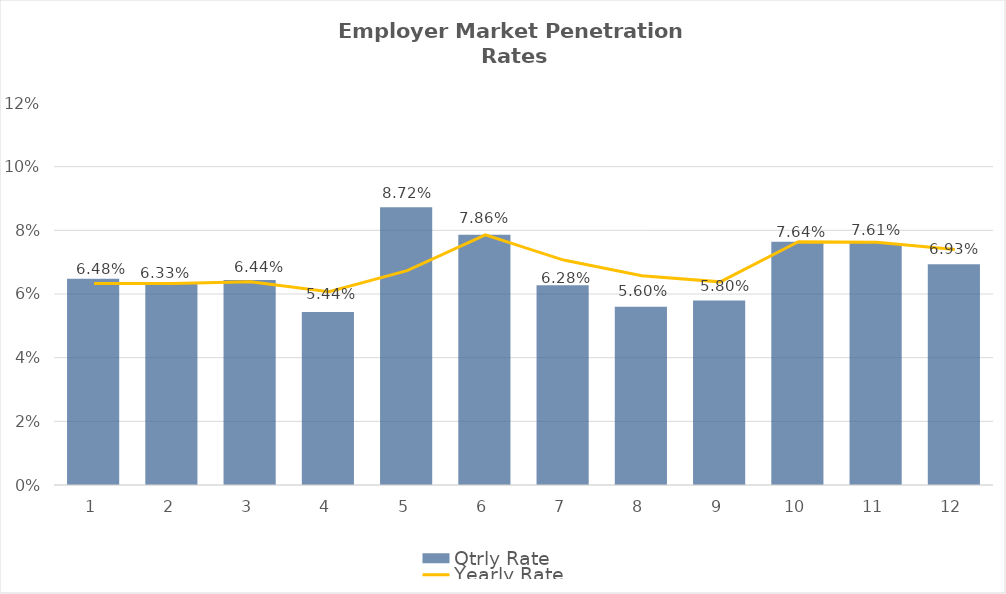
| Category | Qtrly Rate |
|---|---|
| 0 | 0.065 |
| 1 | 0.063 |
| 2 | 0.064 |
| 3 | 0.054 |
| 4 | 0.087 |
| 5 | 0.079 |
| 6 | 0.063 |
| 7 | 0.056 |
| 8 | 0.058 |
| 9 | 0.076 |
| 10 | 0.076 |
| 11 | 0.069 |